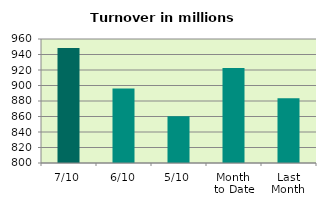
| Category | Series 0 |
|---|---|
| 7/10 | 948.442 |
| 6/10 | 896.252 |
| 5/10 | 860.246 |
| Month 
to Date | 922.708 |
| Last
Month | 883.598 |